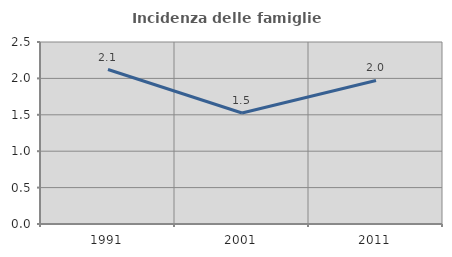
| Category | Incidenza delle famiglie numerose |
|---|---|
| 1991.0 | 2.122 |
| 2001.0 | 1.525 |
| 2011.0 | 1.971 |